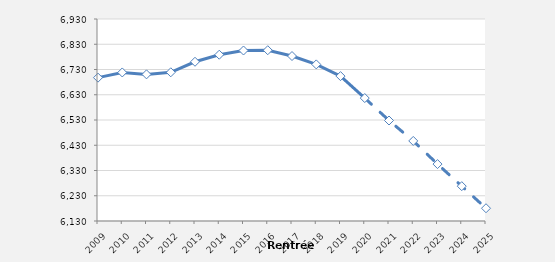
| Category | Series 0 |
|---|---|
| 2009.0 | 6697.7 |
| 2010.0 | 6718.3 |
| 2011.0 | 6710.7 |
| 2012.0 | 6718.9 |
| 2013.0 | 6760.6 |
| 2014.0 | 6788.6 |
| 2015.0 | 6805.2 |
| 2016.0 | 6806.4 |
| 2017.0 | 6783.3 |
| 2018.0 | 6750.2 |
| 2019.0 | 6703.8 |
| 2020.0 | 6616.862 |
| 2021.0 | 6527.961 |
| 2022.0 | 6447.105 |
| 2023.0 | 6355.399 |
| 2024.0 | 6267.985 |
| 2025.0 | 6180.502 |